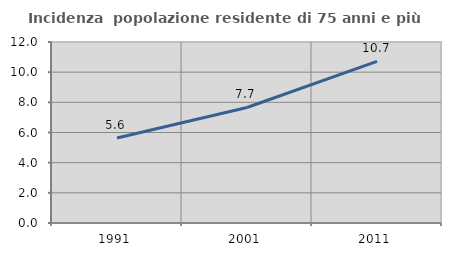
| Category | Incidenza  popolazione residente di 75 anni e più |
|---|---|
| 1991.0 | 5.64 |
| 2001.0 | 7.66 |
| 2011.0 | 10.715 |